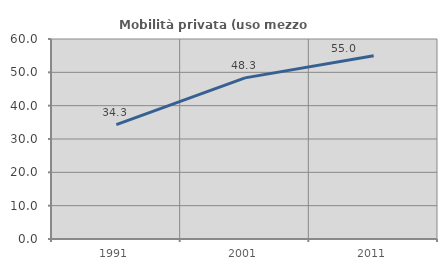
| Category | Mobilità privata (uso mezzo privato) |
|---|---|
| 1991.0 | 34.331 |
| 2001.0 | 48.337 |
| 2011.0 | 55 |